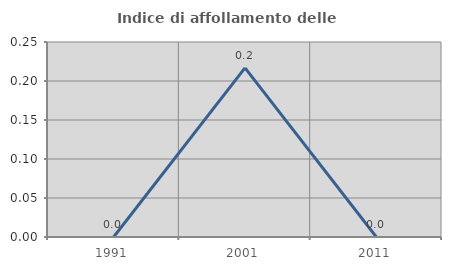
| Category | Indice di affollamento delle abitazioni  |
|---|---|
| 1991.0 | 0 |
| 2001.0 | 0.217 |
| 2011.0 | 0 |